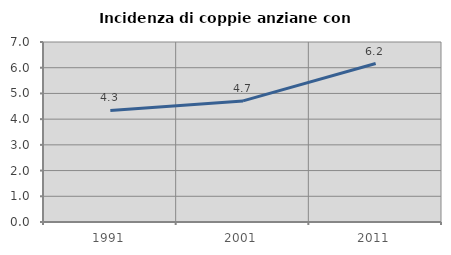
| Category | Incidenza di coppie anziane con figli |
|---|---|
| 1991.0 | 4.336 |
| 2001.0 | 4.71 |
| 2011.0 | 6.162 |